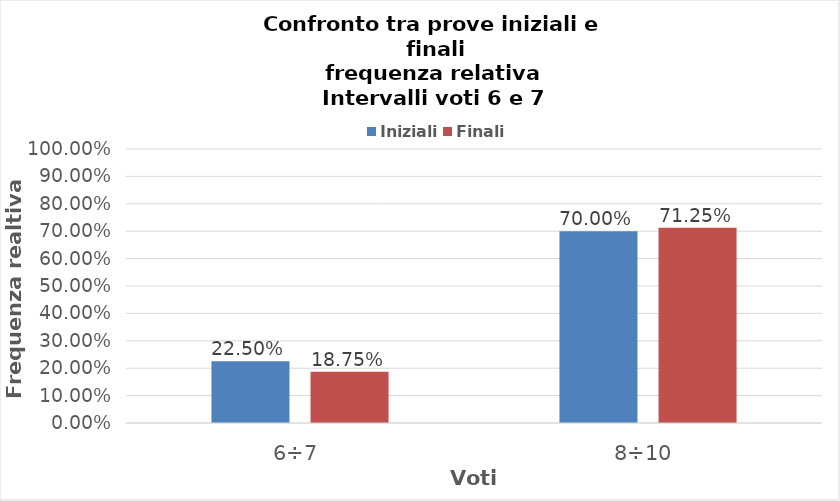
| Category | Iniziali | Finali |
|---|---|---|
| 6÷7 | 0.225 | 0.188 |
| 8÷10 | 0.7 | 0.712 |